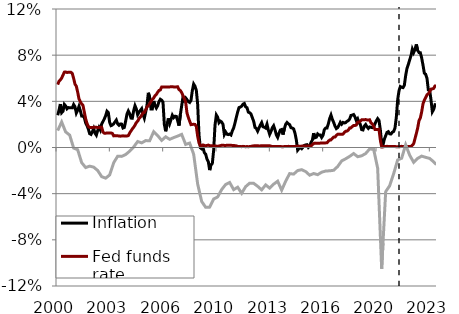
| Category | Inflation | Fed funds rate | Output gap |
|---|---|---|---|
| 2000.0 | 0.028 | 0.054 | 0.015 |
| 2000.0 | 0.032 | 0.057 | 0.017 |
| 2000.0 | 0.038 | 0.058 | 0.02 |
| 2000.0 | 0.03 | 0.06 | 0.022 |
| 2000.0 | 0.031 | 0.063 | 0.019 |
| 2000.0 | 0.037 | 0.065 | 0.016 |
| 2000.0 | 0.036 | 0.065 | 0.013 |
| 2000.0 | 0.034 | 0.065 | 0.013 |
| 2000.0 | 0.035 | 0.065 | 0.012 |
| 2000.0 | 0.035 | 0.065 | 0.011 |
| 2000.0 | 0.034 | 0.065 | 0.007 |
| 2000.0 | 0.034 | 0.064 | 0.003 |
| 2001.0 | 0.037 | 0.06 | -0.001 |
| 2001.0 | 0.035 | 0.055 | -0.001 |
| 2001.0 | 0.03 | 0.053 | -0.001 |
| 2001.0 | 0.032 | 0.048 | -0.002 |
| 2001.0 | 0.036 | 0.042 | -0.006 |
| 2001.0 | 0.032 | 0.04 | -0.009 |
| 2001.0 | 0.027 | 0.038 | -0.013 |
| 2001.0 | 0.027 | 0.036 | -0.015 |
| 2001.0 | 0.026 | 0.031 | -0.016 |
| 2001.0 | 0.021 | 0.025 | -0.017 |
| 2001.0 | 0.019 | 0.021 | -0.017 |
| 2001.0 | 0.016 | 0.018 | -0.017 |
| 2002.0 | 0.012 | 0.017 | -0.016 |
| 2002.0 | 0.011 | 0.017 | -0.016 |
| 2002.0 | 0.014 | 0.017 | -0.017 |
| 2002.0 | 0.016 | 0.018 | -0.017 |
| 2002.0 | 0.012 | 0.018 | -0.018 |
| 2002.0 | 0.011 | 0.018 | -0.019 |
| 2002.0 | 0.015 | 0.017 | -0.02 |
| 2002.0 | 0.017 | 0.017 | -0.022 |
| 2002.0 | 0.015 | 0.018 | -0.023 |
| 2002.0 | 0.02 | 0.018 | -0.025 |
| 2002.0 | 0.023 | 0.013 | -0.026 |
| 2002.0 | 0.025 | 0.012 | -0.026 |
| 2003.0 | 0.028 | 0.012 | -0.027 |
| 2003.0 | 0.031 | 0.013 | -0.026 |
| 2003.0 | 0.03 | 0.012 | -0.025 |
| 2003.0 | 0.022 | 0.013 | -0.024 |
| 2003.0 | 0.019 | 0.013 | -0.02 |
| 2003.0 | 0.019 | 0.012 | -0.017 |
| 2003.0 | 0.021 | 0.01 | -0.013 |
| 2003.0 | 0.022 | 0.01 | -0.011 |
| 2003.0 | 0.024 | 0.01 | -0.009 |
| 2003.0 | 0.02 | 0.01 | -0.008 |
| 2003.0 | 0.019 | 0.01 | -0.008 |
| 2003.0 | 0.02 | 0.01 | -0.008 |
| 2004.0 | 0.02 | 0.01 | -0.008 |
| 2004.0 | 0.017 | 0.01 | -0.007 |
| 2004.0 | 0.017 | 0.01 | -0.007 |
| 2004.0 | 0.023 | 0.01 | -0.006 |
| 2004.0 | 0.029 | 0.01 | -0.005 |
| 2004.0 | 0.032 | 0.01 | -0.004 |
| 2004.0 | 0.029 | 0.013 | -0.003 |
| 2004.0 | 0.025 | 0.014 | -0.002 |
| 2004.0 | 0.025 | 0.016 | -0.001 |
| 2004.0 | 0.032 | 0.018 | 0 |
| 2004.0 | 0.036 | 0.019 | 0.002 |
| 2004.0 | 0.033 | 0.022 | 0.004 |
| 2005.0 | 0.028 | 0.023 | 0.005 |
| 2005.0 | 0.031 | 0.025 | 0.005 |
| 2005.0 | 0.032 | 0.026 | 0.004 |
| 2005.0 | 0.034 | 0.028 | 0.004 |
| 2005.0 | 0.029 | 0.03 | 0.005 |
| 2005.0 | 0.025 | 0.03 | 0.005 |
| 2005.0 | 0.031 | 0.033 | 0.006 |
| 2005.0 | 0.036 | 0.035 | 0.006 |
| 2005.0 | 0.047 | 0.036 | 0.006 |
| 2005.0 | 0.044 | 0.038 | 0.006 |
| 2005.0 | 0.033 | 0.04 | 0.008 |
| 2005.0 | 0.033 | 0.042 | 0.011 |
| 2006.0 | 0.04 | 0.043 | 0.014 |
| 2006.0 | 0.036 | 0.045 | 0.013 |
| 2006.0 | 0.034 | 0.046 | 0.011 |
| 2006.0 | 0.036 | 0.048 | 0.01 |
| 2006.0 | 0.04 | 0.049 | 0.009 |
| 2006.0 | 0.042 | 0.05 | 0.008 |
| 2006.0 | 0.041 | 0.052 | 0.006 |
| 2006.0 | 0.039 | 0.052 | 0.007 |
| 2006.0 | 0.02 | 0.052 | 0.008 |
| 2006.0 | 0.014 | 0.052 | 0.009 |
| 2006.0 | 0.02 | 0.052 | 0.009 |
| 2006.0 | 0.025 | 0.052 | 0.008 |
| 2007.0 | 0.021 | 0.052 | 0.007 |
| 2007.0 | 0.024 | 0.053 | 0.008 |
| 2007.0 | 0.028 | 0.053 | 0.008 |
| 2007.0 | 0.026 | 0.052 | 0.009 |
| 2007.0 | 0.027 | 0.052 | 0.009 |
| 2007.0 | 0.027 | 0.052 | 0.009 |
| 2007.0 | 0.023 | 0.053 | 0.01 |
| 2007.0 | 0.019 | 0.05 | 0.01 |
| 2007.0 | 0.028 | 0.049 | 0.011 |
| 2007.0 | 0.036 | 0.048 | 0.011 |
| 2007.0 | 0.044 | 0.045 | 0.008 |
| 2007.0 | 0.041 | 0.042 | 0.006 |
| 2008.0 | 0.043 | 0.039 | 0.003 |
| 2008.0 | 0.041 | 0.03 | 0.003 |
| 2008.0 | 0.04 | 0.026 | 0.003 |
| 2008.0 | 0.039 | 0.023 | 0.004 |
| 2008.0 | 0.041 | 0.02 | 0.001 |
| 2008.0 | 0.049 | 0.02 | -0.003 |
| 2008.0 | 0.055 | 0.02 | -0.006 |
| 2008.0 | 0.053 | 0.02 | -0.014 |
| 2008.0 | 0.05 | 0.018 | -0.023 |
| 2008.0 | 0.037 | 0.01 | -0.032 |
| 2008.0 | 0.011 | 0.004 | -0.037 |
| 2008.0 | 0 | 0.002 | -0.042 |
| 2009.0 | -0.001 | 0.002 | -0.047 |
| 2009.0 | 0 | 0.002 | -0.048 |
| 2009.0 | -0.004 | 0.002 | -0.05 |
| 2009.0 | -0.006 | 0.002 | -0.052 |
| 2009.0 | -0.01 | 0.002 | -0.052 |
| 2009.0 | -0.012 | 0.002 | -0.052 |
| 2009.0 | -0.02 | 0.002 | -0.052 |
| 2009.0 | -0.015 | 0.002 | -0.049 |
| 2009.0 | -0.014 | 0.002 | -0.047 |
| 2009.0 | -0.002 | 0.001 | -0.045 |
| 2009.0 | 0.019 | 0.001 | -0.044 |
| 2009.0 | 0.028 | 0.001 | -0.043 |
| 2010.0 | 0.026 | 0.001 | -0.043 |
| 2010.0 | 0.022 | 0.001 | -0.041 |
| 2010.0 | 0.023 | 0.002 | -0.039 |
| 2010.0 | 0.022 | 0.002 | -0.036 |
| 2010.0 | 0.02 | 0.002 | -0.035 |
| 2010.0 | 0.011 | 0.002 | -0.033 |
| 2010.0 | 0.013 | 0.002 | -0.032 |
| 2010.0 | 0.012 | 0.002 | -0.031 |
| 2010.0 | 0.011 | 0.002 | -0.031 |
| 2010.0 | 0.012 | 0.002 | -0.03 |
| 2010.0 | 0.011 | 0.002 | -0.032 |
| 2010.0 | 0.014 | 0.002 | -0.034 |
| 2011.0 | 0.017 | 0.002 | -0.036 |
| 2011.0 | 0.021 | 0.002 | -0.036 |
| 2011.0 | 0.026 | 0.001 | -0.035 |
| 2011.0 | 0.031 | 0.001 | -0.034 |
| 2011.0 | 0.035 | 0.001 | -0.036 |
| 2011.0 | 0.035 | 0.001 | -0.038 |
| 2011.0 | 0.036 | 0.001 | -0.04 |
| 2011.0 | 0.038 | 0.001 | -0.038 |
| 2011.0 | 0.038 | 0.001 | -0.036 |
| 2011.0 | 0.035 | 0.001 | -0.034 |
| 2011.0 | 0.035 | 0.001 | -0.033 |
| 2011.0 | 0.031 | 0.001 | -0.032 |
| 2012.0 | 0.03 | 0.001 | -0.031 |
| 2012.0 | 0.029 | 0.001 | -0.031 |
| 2012.0 | 0.026 | 0.001 | -0.031 |
| 2012.0 | 0.023 | 0.001 | -0.031 |
| 2012.0 | 0.017 | 0.002 | -0.032 |
| 2012.0 | 0.017 | 0.002 | -0.033 |
| 2012.0 | 0.014 | 0.002 | -0.034 |
| 2012.0 | 0.017 | 0.001 | -0.035 |
| 2012.0 | 0.019 | 0.001 | -0.036 |
| 2012.0 | 0.022 | 0.002 | -0.037 |
| 2012.0 | 0.018 | 0.002 | -0.035 |
| 2012.0 | 0.018 | 0.002 | -0.034 |
| 2013.0 | 0.017 | 0.001 | -0.032 |
| 2013.0 | 0.02 | 0.002 | -0.033 |
| 2013.0 | 0.015 | 0.001 | -0.034 |
| 2013.0 | 0.011 | 0.002 | -0.035 |
| 2013.0 | 0.014 | 0.001 | -0.034 |
| 2013.0 | 0.017 | 0.001 | -0.033 |
| 2013.0 | 0.019 | 0.001 | -0.032 |
| 2013.0 | 0.015 | 0.001 | -0.031 |
| 2013.0 | 0.011 | 0.001 | -0.03 |
| 2013.0 | 0.009 | 0.001 | -0.029 |
| 2013.0 | 0.012 | 0.001 | -0.032 |
| 2013.0 | 0.015 | 0.001 | -0.034 |
| 2014.0 | 0.016 | 0.001 | -0.037 |
| 2014.0 | 0.011 | 0.001 | -0.034 |
| 2014.0 | 0.016 | 0.001 | -0.032 |
| 2014.0 | 0.02 | 0.001 | -0.029 |
| 2014.0 | 0.022 | 0.001 | -0.027 |
| 2014.0 | 0.021 | 0.001 | -0.025 |
| 2014.0 | 0.02 | 0.001 | -0.023 |
| 2014.0 | 0.017 | 0.001 | -0.023 |
| 2014.0 | 0.017 | 0.001 | -0.023 |
| 2014.0 | 0.016 | 0.001 | -0.023 |
| 2014.0 | 0.012 | 0.001 | -0.022 |
| 2014.0 | 0.007 | 0.001 | -0.021 |
| 2015.0 | -0.002 | 0.001 | -0.02 |
| 2015.0 | -0.001 | 0.001 | -0.02 |
| 2015.0 | 0 | 0.001 | -0.019 |
| 2015.0 | -0.001 | 0.001 | -0.019 |
| 2015.0 | 0 | 0.001 | -0.02 |
| 2015.0 | 0.002 | 0.001 | -0.02 |
| 2015.0 | 0.002 | 0.001 | -0.021 |
| 2015.0 | 0.002 | 0.001 | -0.022 |
| 2015.0 | 0 | 0.001 | -0.023 |
| 2015.0 | 0.001 | 0.001 | -0.024 |
| 2015.0 | 0.004 | 0.001 | -0.024 |
| 2015.0 | 0.006 | 0.002 | -0.023 |
| 2016.0 | 0.012 | 0.003 | -0.023 |
| 2016.0 | 0.008 | 0.004 | -0.023 |
| 2016.0 | 0.009 | 0.004 | -0.023 |
| 2016.0 | 0.012 | 0.004 | -0.024 |
| 2016.0 | 0.011 | 0.004 | -0.023 |
| 2016.0 | 0.011 | 0.004 | -0.022 |
| 2016.0 | 0.009 | 0.004 | -0.021 |
| 2016.0 | 0.011 | 0.004 | -0.021 |
| 2016.0 | 0.015 | 0.004 | -0.021 |
| 2016.0 | 0.017 | 0.004 | -0.02 |
| 2016.0 | 0.017 | 0.004 | -0.02 |
| 2016.0 | 0.021 | 0.005 | -0.02 |
| 2017.0 | 0.025 | 0.007 | -0.02 |
| 2017.0 | 0.028 | 0.007 | -0.02 |
| 2017.0 | 0.024 | 0.008 | -0.02 |
| 2017.0 | 0.022 | 0.009 | -0.02 |
| 2017.0 | 0.019 | 0.009 | -0.019 |
| 2017.0 | 0.016 | 0.01 | -0.018 |
| 2017.0 | 0.017 | 0.012 | -0.016 |
| 2017.0 | 0.019 | 0.012 | -0.015 |
| 2017.0 | 0.022 | 0.012 | -0.013 |
| 2017.0 | 0.02 | 0.012 | -0.012 |
| 2017.0 | 0.022 | 0.012 | -0.011 |
| 2017.0 | 0.021 | 0.013 | -0.01 |
| 2018.0 | 0.022 | 0.014 | -0.01 |
| 2018.0 | 0.023 | 0.014 | -0.009 |
| 2018.0 | 0.023 | 0.015 | -0.008 |
| 2018.0 | 0.025 | 0.017 | -0.008 |
| 2018.0 | 0.028 | 0.017 | -0.007 |
| 2018.0 | 0.028 | 0.018 | -0.006 |
| 2018.0 | 0.029 | 0.019 | -0.005 |
| 2018.0 | 0.026 | 0.019 | -0.006 |
| 2018.0 | 0.023 | 0.02 | -0.007 |
| 2018.0 | 0.025 | 0.022 | -0.008 |
| 2018.0 | 0.021 | 0.022 | -0.008 |
| 2018.0 | 0.02 | 0.023 | -0.007 |
| 2019.0 | 0.016 | 0.024 | -0.007 |
| 2019.0 | 0.015 | 0.024 | -0.007 |
| 2019.0 | 0.019 | 0.024 | -0.006 |
| 2019.0 | 0.02 | 0.024 | -0.005 |
| 2019.0 | 0.018 | 0.024 | -0.004 |
| 2019.0 | 0.016 | 0.024 | -0.003 |
| 2019.0 | 0.018 | 0.024 | -0.001 |
| 2019.0 | 0.017 | 0.021 | -0.001 |
| 2019.0 | 0.017 | 0.02 | -0.002 |
| 2019.0 | 0.018 | 0.018 | -0.002 |
| 2019.0 | 0.021 | 0.016 | -0.007 |
| 2019.0 | 0.023 | 0.016 | -0.012 |
| 2020.0 | 0.025 | 0.016 | -0.018 |
| 2020.0 | 0.023 | 0.016 | -0.047 |
| 2020.0 | 0.015 | 0.007 | -0.076 |
| 2020.0 | 0.003 | 0 | -0.105 |
| 2020.0 | 0.002 | 0 | -0.083 |
| 2020.0 | 0.007 | 0.001 | -0.061 |
| 2020.0 | 0.01 | 0.001 | -0.038 |
| 2020.0 | 0.013 | 0.001 | -0.037 |
| 2020.0 | 0.014 | 0.001 | -0.035 |
| 2020.0 | 0.012 | 0.001 | -0.033 |
| 2020.0 | 0.012 | 0.001 | -0.03 |
| 2020.0 | 0.013 | 0.001 | -0.026 |
| 2021.0 | 0.014 | 0.001 | -0.023 |
| 2021.0 | 0.017 | 0.001 | -0.019 |
| 2021.0 | 0.026 | 0.001 | -0.015 |
| 2021.0 | 0.041 | 0.001 | -0.011 |
| 2021.0 | 0.049 | 0.001 | -0.01 |
| 2021.0 | 0.053 | 0.001 | -0.01 |
| 2021.0 | 0.052 | 0.001 | -0.009 |
| 2021.0 | 0.052 | 0.001 | -0.005 |
| 2021.0 | 0.054 | 0.001 | -0.001 |
| 2021.0 | 0.062 | 0.001 | 0.002 |
| 2021.0 | 0.069 | 0.001 | -0.001 |
| 2021.0 | 0.072 | 0.001 | -0.004 |
| 2022.0 | 0.076 | 0.001 | -0.007 |
| 2022.0 | 0.08 | 0.001 | -0.009 |
| 2022.0 | 0.085 | 0.002 | -0.011 |
| 2022.0 | 0.082 | 0.003 | -0.013 |
| 2022.0 | 0.085 | 0.008 | -0.012 |
| 2022.0 | 0.089 | 0.012 | -0.011 |
| 2022.0 | 0.084 | 0.017 | -0.009 |
| 2022.0 | 0.082 | 0.023 | -0.009 |
| 2022.0 | 0.082 | 0.026 | -0.008 |
| 2022.0 | 0.078 | 0.031 | -0.007 |
| 2022.0 | 0.071 | 0.038 | -0.008 |
| 2022.0 | 0.064 | 0.041 | -0.008 |
| 2023.0 | 0.063 | 0.043 | -0.009 |
| 2023.0 | 0.06 | 0.046 | -0.009 |
| 2023.0 | 0.05 | 0.047 | -0.009 |
| 2023.0 | 0.05 | 0.048 | -0.009 |
| 2023.0 | 0.041 | 0.051 | -0.01 |
| 2023.0 | 0.031 | 0.051 | -0.011 |
| 2023.0 | 0.033 | 0.051 | -0.012 |
| 2023.0 | 0.037 | 0.053 | -0.014 |
| 2023.0 | 0.037 | 0.053 | -0.015 |